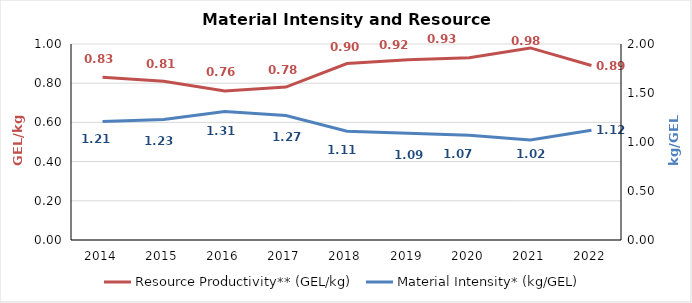
| Category | Resource Productivity** (GEL/kg) |
|---|---|
| 2014.0 | 0.83 |
| 2015.0 | 0.81 |
| 2016.0 | 0.76 |
| 2017.0 | 0.78 |
| 2018.0 | 0.9 |
| 2019.0 | 0.92 |
| 2020.0 | 0.93 |
| 2021.0 | 0.98 |
| 2022.0 | 0.89 |